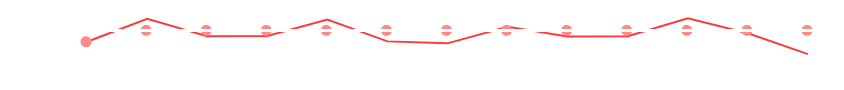
| Category | Cash Flow |
|---|---|
| jan | -3714 |
| feb | 3790 |
| mar | -1933 |
| apr | -1813 |
| may | 3532 |
| jun | -3593 |
| jul | -4243 |
| aug | 1147 |
| sep | -1983 |
| oct | -1943 |
| nov | 3942 |
| dec | -958 |
| year | -7769 |